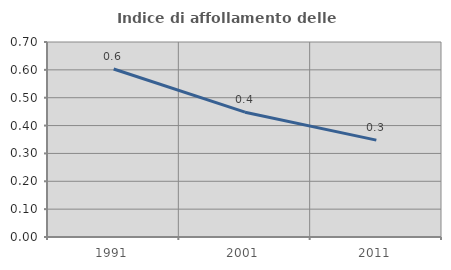
| Category | Indice di affollamento delle abitazioni  |
|---|---|
| 1991.0 | 0.603 |
| 2001.0 | 0.448 |
| 2011.0 | 0.348 |